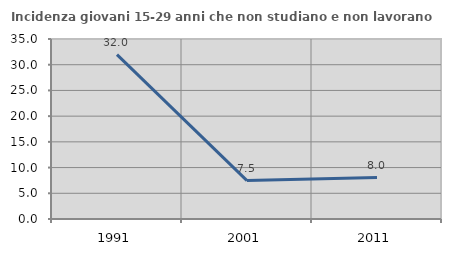
| Category | Incidenza giovani 15-29 anni che non studiano e non lavorano  |
|---|---|
| 1991.0 | 31.959 |
| 2001.0 | 7.477 |
| 2011.0 | 8.046 |